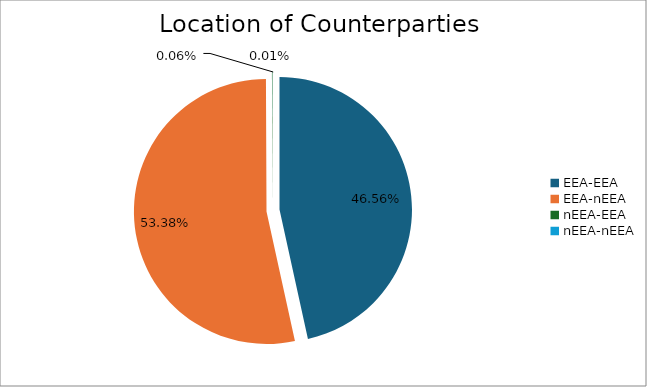
| Category | Series 0 |
|---|---|
| EEA-EEA | 6571629.904 |
| EEA-nEEA | 7534339.446 |
| nEEA-EEA | 8739.49 |
| nEEA-nEEA | 735.386 |